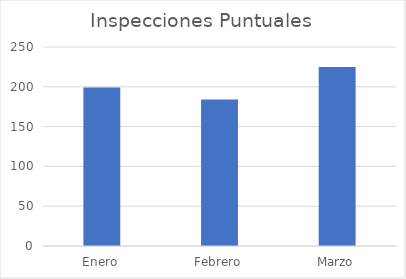
| Category | Inspecciones Puntuales |
|---|---|
| Enero | 199 |
| Febrero | 184 |
| Marzo | 225 |